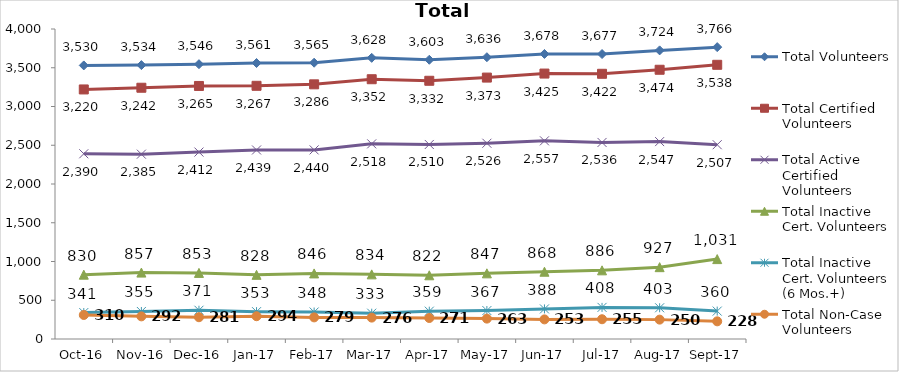
| Category | Total Volunteers | Total Certified Volunteers | Total Active Certified Volunteers | Total Inactive Cert. Volunteers | Total Inactive Cert. Volunteers (6 Mos.+) | Total Non-Case Volunteers |
|---|---|---|---|---|---|---|
| 2016-10-01 | 3530 | 3220 | 2390 | 830 | 341 | 310 |
| 2016-11-01 | 3534 | 3242 | 2385 | 857 | 355 | 292 |
| 2016-12-01 | 3546 | 3265 | 2412 | 853 | 371 | 281 |
| 2017-01-01 | 3561 | 3267 | 2439 | 828 | 353 | 294 |
| 2017-02-01 | 3565 | 3286 | 2440 | 846 | 348 | 279 |
| 2017-03-01 | 3628 | 3352 | 2518 | 834 | 333 | 276 |
| 2017-04-01 | 3603 | 3332 | 2510 | 822 | 359 | 271 |
| 2017-05-01 | 3636 | 3373 | 2526 | 847 | 367 | 263 |
| 2017-06-01 | 3678 | 3425 | 2557 | 868 | 388 | 253 |
| 2017-07-01 | 3677 | 3422 | 2536 | 886 | 408 | 255 |
| 2017-08-01 | 3724 | 3474 | 2547 | 927 | 403 | 250 |
| 2017-09-01 | 3766 | 3538 | 2507 | 1031 | 360 | 228 |